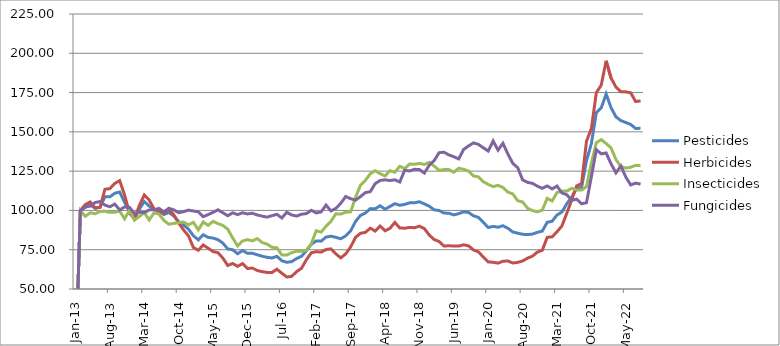
| Category | Pesticides | Herbicides | Insecticides | Fungicides |
|---|---|---|---|---|
| 2013-01-01 | 0 | 0 | 0 | 0 |
| 2013-02-01 | 100 | 100 | 100 | 100 |
| 2013-03-01 | 101.86 | 103.73 | 96.25 | 102.25 |
| 2013-04-01 | 103.54 | 105.41 | 98.49 | 102.75 |
| 2013-05-01 | 101.38 | 101.6 | 97.91 | 105.04 |
| 2013-06-01 | 102.05 | 101.95 | 99.35 | 105.64 |
| 2013-07-01 | 108.75 | 113.45 | 99.47 | 103.4 |
| 2013-08-01 | 108.66 | 113.89 | 98.76 | 102.31 |
| 2013-09-01 | 110.93 | 117.17 | 98.83 | 104.03 |
| 2013-10-01 | 111.72 | 118.97 | 99.58 | 100.36 |
| 2013-11-01 | 105.11 | 109.76 | 94.68 | 102.2 |
| 2013-12-01 | 99.53 | 98.22 | 100.2 | 101.97 |
| 2014-01-01 | 94.86 | 94.59 | 93.82 | 98.06 |
| 2014-02-01 | 100.72 | 103.14 | 96.13 | 98.83 |
| 2014-03-01 | 105.69 | 109.79 | 98.7 | 98.63 |
| 2014-04-01 | 102.75 | 106.62 | 93.91 | 100.34 |
| 2014-05-01 | 100.53 | 100.97 | 98.5 | 100.39 |
| 2014-06-01 | 99.51 | 99.46 | 97.63 | 101.31 |
| 2014-07-01 | 97.42 | 98.22 | 93.67 | 99.09 |
| 2014-08-01 | 98.62 | 100.75 | 91.21 | 101.37 |
| 2014-09-01 | 96.54 | 97.31 | 91.76 | 100.36 |
| 2014-10-01 | 92.9 | 92 | 92.16 | 98.55 |
| 2014-11-01 | 90.7 | 87.56 | 92.62 | 99.2 |
| 2014-12-01 | 88.11 | 83.84 | 90.83 | 100.2 |
| 2015-01-01 | 83.95 | 76.41 | 92.43 | 99.62 |
| 2015-02-01 | 81.28 | 74.64 | 87.63 | 99.13 |
| 2015-03-01 | 84.5 | 78.02 | 92.66 | 96.01 |
| 2015-04-01 | 82.86 | 75.97 | 90.49 | 97.33 |
| 2015-05-01 | 82.39 | 73.84 | 93.06 | 98.81 |
| 2015-06-01 | 81.39 | 73.1 | 91.59 | 100.4 |
| 2015-07-01 | 79.19 | 69.65 | 90.49 | 98.48 |
| 2015-08-01 | 75.45 | 64.97 | 88.01 | 96.63 |
| 2015-09-01 | 75.01 | 66.23 | 82.45 | 98.49 |
| 2015-10-01 | 72.43 | 64.4 | 77.42 | 97.33 |
| 2015-11-01 | 74.47 | 66.15 | 80.55 | 98.52 |
| 2015-12-01 | 72.72 | 63.05 | 81.42 | 97.76 |
| 2016-01-01 | 72.74 | 63.33 | 80.62 | 98.22 |
| 2016-02-01 | 71.79 | 61.77 | 82.09 | 97.09 |
| 2016-03-01 | 70.83 | 61.03 | 79.6 | 96.34 |
| 2016-04-01 | 70.17 | 60.53 | 78.56 | 95.74 |
| 2016-05-01 | 69.75 | 60.5 | 76.56 | 96.68 |
| 2016-06-01 | 70.78 | 62.58 | 76.25 | 97.52 |
| 2016-07-01 | 67.98 | 60.01 | 71.69 | 95.2 |
| 2016-08-01 | 67.02 | 57.65 | 71.6 | 98.8 |
| 2016-09-01 | 67.4 | 58.01 | 73.11 | 97.11 |
| 2016-10-01 | 69.38 | 61.05 | 74.01 | 96.4 |
| 2016-11-01 | 70.83 | 63.2 | 73.98 | 97.58 |
| 2016-12-01 | 74.36 | 68.62 | 74.66 | 98 |
| 2017-01-01 | 78.44 | 73.06 | 78.89 | 100.07 |
| 2017-02-01 | 80.58 | 73.72 | 87.07 | 98.41 |
| 2017-03-01 | 80.46 | 73.47 | 86.19 | 99.08 |
| 2017-04-01 | 83.03 | 75.11 | 89.97 | 103.4 |
| 2017-05-01 | 83.62 | 75.55 | 93.12 | 99.68 |
| 2017-06-01 | 82.85 | 72.35 | 97.87 | 101.32 |
| 2017-07-01 | 81.98 | 69.8 | 97.67 | 104.56 |
| 2017-08-01 | 83.79 | 72.33 | 98.85 | 108.87 |
| 2017-09-01 | 86.97 | 76.76 | 99.11 | 107.47 |
| 2017-10-01 | 92.97 | 82.89 | 108.32 | 106.55 |
| 2017-11-01 | 96.82 | 85.43 | 116.02 | 108.78 |
| 2017-12-01 | 98.36 | 86.04 | 119.16 | 111.35 |
| 2018-01-01 | 101.16 | 88.71 | 123.39 | 111.94 |
| 2018-02-01 | 101.01 | 86.86 | 125.32 | 117.07 |
| 2018-03-01 | 102.96 | 90.09 | 123.38 | 119.08 |
| 2018-04-01 | 100.78 | 87.02 | 121.94 | 119.48 |
| 2018-05-01 | 102.54 | 88.59 | 125.28 | 119 |
| 2018-06-01 | 104.28 | 92.36 | 124.28 | 119.49 |
| 2018-07-01 | 103.29 | 88.83 | 128.1 | 118.08 |
| 2018-08-01 | 103.83 | 88.69 | 126.62 | 125.54 |
| 2018-09-01 | 104.83 | 89.19 | 129.48 | 125.12 |
| 2018-10-01 | 104.84 | 89 | 129.43 | 126.15 |
| 2018-11-01 | 105.53 | 89.97 | 129.9 | 126 |
| 2018-12-01 | 104.14 | 88.45 | 129.25 | 123.79 |
| 2019-01-01 | 102.69 | 84.31 | 130.6 | 128.81 |
| 2019-02-01 | 100.36 | 81.5 | 128.2 | 131.74 |
| 2019-03-01 | 99.95 | 80.24 | 125.56 | 136.74 |
| 2019-04-01 | 98.33 | 77.33 | 125.97 | 137.04 |
| 2019-05-01 | 98.22 | 77.53 | 125.99 | 135.32 |
| 2019-06-01 | 97.16 | 77.35 | 124.26 | 134.17 |
| 2019-07-01 | 97.97 | 77.31 | 126.84 | 132.8 |
| 2019-08-01 | 99.09 | 78.12 | 126.15 | 138.83 |
| 2019-09-01 | 98.72 | 77.49 | 125.05 | 141.05 |
| 2019-10-01 | 96.57 | 74.82 | 121.98 | 142.98 |
| 2019-11-01 | 95.57 | 73.68 | 121.34 | 142.02 |
| 2019-12-01 | 92.44 | 70.31 | 118.29 | 139.86 |
| 2020-01-01 | 89.14 | 67.24 | 116.56 | 137.78 |
| 2020-02-01 | 89.83 | 67 | 115.16 | 144.2 |
| 2020-03-01 | 89.31 | 66.46 | 116 | 138.36 |
| 2020-04-01 | 90.27 | 67.69 | 114.59 | 142.72 |
| 2020-05-01 | 88.67 | 67.81 | 111.68 | 135.91 |
| 2020-06-01 | 86.31 | 66.54 | 110.49 | 129.97 |
| 2020-07-01 | 85.53 | 66.94 | 106.2 | 127.19 |
| 2020-08-01 | 84.8 | 67.82 | 105.38 | 119.47 |
| 2020-09-01 | 84.65 | 69.62 | 101.45 | 117.85 |
| 2020-10-01 | 84.94 | 70.9 | 99.88 | 117.25 |
| 2020-11-01 | 86.06 | 73.49 | 99.11 | 115.46 |
| 2020-12-01 | 86.84 | 74.62 | 100.2 | 114.08 |
| 2021-01-01 | 92.44 | 82.86 | 107.66 | 115.6 |
| 2021-02-01 | 93.1 | 83.2 | 106.03 | 113.7 |
| 2021-03-01 | 97.1 | 86.39 | 111.35 | 115.53 |
| 2021-04-01 | 99.01 | 90.14 | 112.27 | 111.11 |
| 2021-05-01 | 104.34 | 98.32 | 112.32 | 109.98 |
| 2021-06-01 | 108.46 | 106.76 | 114.1 | 106.37 |
| 2021-07-01 | 114.14 | 115.61 | 113.07 | 107.2 |
| 2021-08-01 | 114.58 | 117.06 | 112.93 | 104.23 |
| 2021-09-01 | 131.63 | 144.02 | 115.28 | 104.92 |
| 2021-10-02 | 142.67 | 152.11 | 130.16 | 121.53 |
| 2021-11-03 | 162.2 | 174.93 | 143.1 | 138.66 |
| 2021-12-03 | 165.28 | 179.75 | 145.06 | 136.01 |
| 2022-01-03 | 174.07 | 195.2 | 142.57 | 136.57 |
| 2022-02-03 | 165.33 | 184.23 | 139.8 | 129.63 |
| 2022-03-03 | 159.55 | 178.46 | 132.39 | 123.92 |
| 2022-04-04 | 157.17 | 175.53 | 127.84 | 128.27 |
| 2022-05-05 | 155.95 | 175.45 | 126.98 | 121.23 |
| 2022-06-06 | 154.71 | 174.85 | 127.47 | 116.21 |
| 2022-07-07 | 152.14 | 169.29 | 128.68 | 117.38 |
| 2022-08-07 | 152.26 | 169.7 | 128.49 | 116.75 |